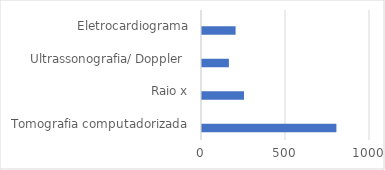
| Category | Series 0 | Series 1 |
|---|---|---|
| Tomografia computadorizada | 800 | 0 |
| Raio x | 250 | 0 |
| Ultrassonografia/ Doppler  | 160 | 0 |
| Eletrocardiograma | 200 | 0 |